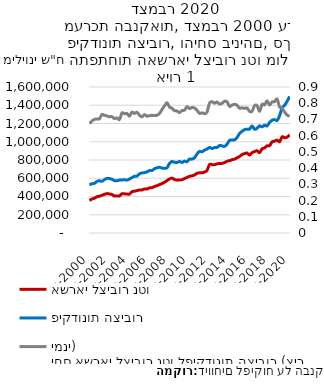
| Category | אשראי לציבור נטו | פיקדונות הציבור |
|---|---|---|
| 2000-12-31 | 356462.655 | 528222.858 |
| 2001-03-31 | 372463.294 | 539572.759 |
| 2001-06-30 | 381154.208 | 544248.511 |
| 2001-09-30 | 397173.093 | 565086.016 |
| 2001-12-31 | 403184.122 | 572756.737 |
| 2002-03-31 | 413314.71 | 566306.141 |
| 2002-06-30 | 424195.605 | 584427.018 |
| 2002-09-30 | 431731.186 | 598122.824 |
| 2002-12-31 | 427635.341 | 596605.162 |
| 2003-03-31 | 422425.306 | 589026.661 |
| 2003-06-30 | 404910.477 | 574227.071 |
| 2003-09-30 | 406599.503 | 572943.316 |
| 2003-12-31 | 405404.982 | 579568.743 |
| 2004-03-31 | 430077.981 | 581189.313 |
| 2004-06-30 | 429038.245 | 583437.832 |
| 2004-09-30 | 427133.321 | 579486.92 |
| 2004-12-31 | 425668.859 | 591134.37 |
| 2005-03-31 | 452350.901 | 606994.419 |
| 2005-06-30 | 458121.368 | 621558.713 |
| 2005-09-30 | 464424.225 | 624079.234 |
| 2005-12-31 | 470971.361 | 648661.994 |
| 2006-03-31 | 471175.404 | 657836.776 |
| 2006-06-30 | 482825.57 | 661585.085 |
| 2006-09-30 | 482120.382 | 669354.431 |
| 2006-12-31 | 494789.018 | 684092.991 |
| 2007-03-31 | 496392.195 | 684332.759 |
| 2007-06-30 | 509891.875 | 704642.433 |
| 2007-09-30 | 518178.227 | 713876.894 |
| 2007-12-31 | 530468.91 | 720126.725 |
| 2008-03-31 | 541502.79 | 711504.194 |
| 2008-06-30 | 555574.388 | 709236 |
| 2008-09-30 | 574146.924 | 714519.259 |
| 2008-12-31 | 591681.329 | 762275.857 |
| 2009-03-31 | 601808.813 | 782764.218 |
| 2009-06-30 | 585103.566 | 775798.713 |
| 2009-09-30 | 581527.735 | 773018.383 |
| 2009-12-31 | 581770.215 | 783865.035 |
| 2010-03-31 | 583587.128 | 772938.596 |
| 2010-06-30 | 596489.393 | 787773.236 |
| 2010-09-30 | 608239.412 | 780841.52 |
| 2010-12-31 | 621439.77 | 810097.867 |
| 2011-03-31 | 626266.218 | 809736.035 |
| 2011-06-30 | 635441.922 | 825105.434 |
| 2011-09-30 | 654462.294 | 865139.654 |
| 2011-12-31 | 659439.985 | 894154.885 |
| 2012-03-31 | 659757.14 | 890602.75 |
| 2012-06-30 | 667852.191 | 907662.999 |
| 2012-09-30 | 685220.321 | 919550.679 |
| 2012-12-31 | 750716.626 | 937856.699 |
| 2013-03-31 | 749297.255 | 925647.665 |
| 2013-06-30 | 749236.85 | 936334 |
| 2013-09-30 | 757215.52 | 937773.181 |
| 2013-12-31 | 762192.516 | 959132.784 |
| 2014-03-31 | 763094.559 | 954176.603 |
| 2014-06-30 | 771048.017 | 949596.432 |
| 2014-09-30 | 786394.581 | 972243.091 |
| 2014-12-31 | 792389.323 | 1014854.239 |
| 2015-03-31 | 803049.963 | 1018977.54 |
| 2015-06-30 | 809301.595 | 1020444.516 |
| 2015-09-30 | 824435.838 | 1046636.701 |
| 2015-12-31 | 838587.219 | 1090012.586 |
| 2016-03-31 | 859982.06 | 1114210.362 |
| 2016-06-30 | 869877.433 | 1132507.135 |
| 2016-09-30 | 876145.725 | 1137146.737 |
| 2016-12-31 | 854160.648 | 1139062.588 |
| 2017-03-31 | 880182.564 | 1173320.288 |
| 2017-06-30 | 892282.98 | 1136479.439 |
| 2017-09-30 | 901451.22 | 1148178.944 |
| 2017-12-31 | 880794.344 | 1174080.243 |
| 2018-03-31 | 922563.144 | 1163213.975 |
| 2018-06-30 | 932462.924 | 1180552.481 |
| 2018-09-30 | 955663.592 | 1172783.032 |
| 2018-12-31 | 956298.297 | 1211794.66 |
| 2019-03-31 | 998459.178 | 1235308.515 |
| 2019-06-30 | 1006337.525 | 1242947.913 |
| 2019-09-30 | 1017975.199 | 1232707.244 |
| 2019-12-31 | 999714.979 | 1285295.429 |
| 2020-03-31 | 1053026.334 | 1369667.515 |
| 2020-06-30 | 1044012.396 | 1399620.158 |
| 2020-09-30 | 1049478.388 | 1443160.433 |
| 2020-12-31 | 1076571.07 | 1497063.186 |